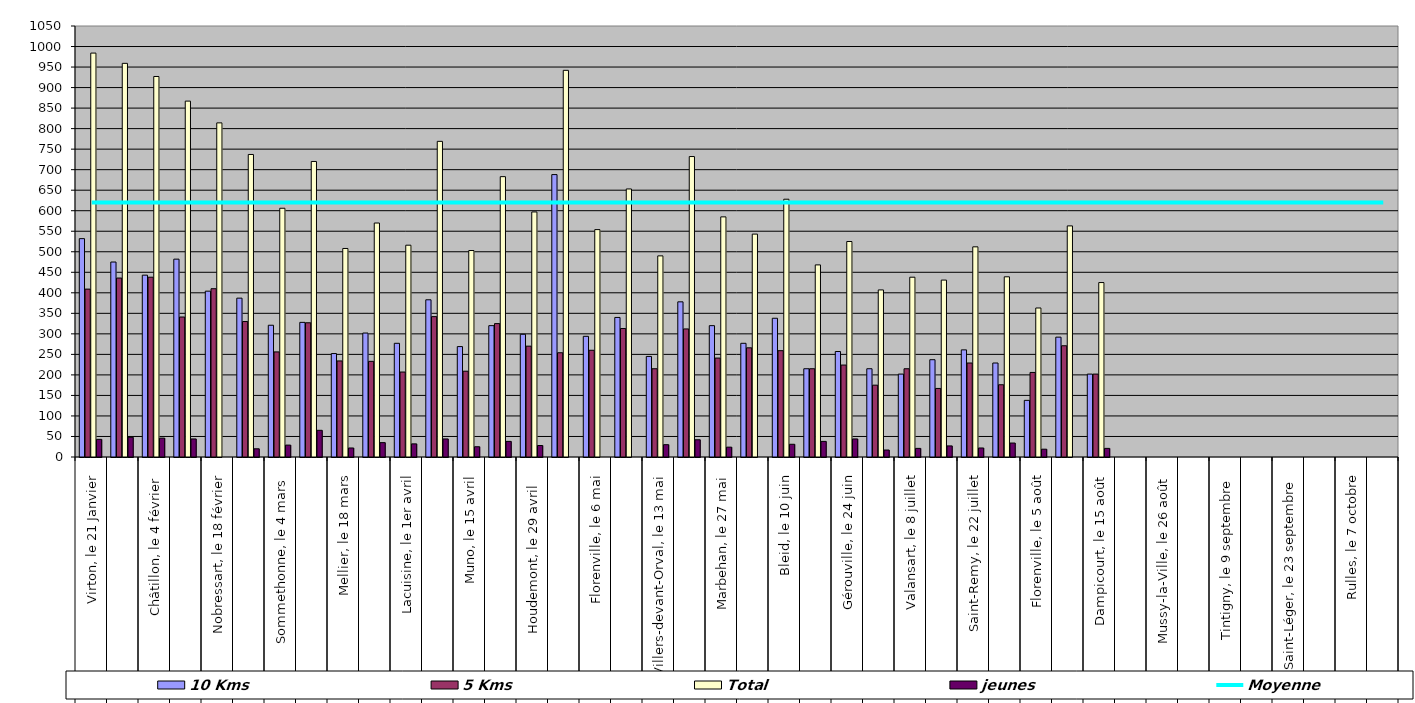
| Category | 10 Kms | 5 Kms | Total | jeunes |
|---|---|---|---|---|
| 0 | 532 | 409 | 984 | 43 |
| 1 | 475 | 436 | 959 | 48 |
| 2 | 443 | 438 | 927 | 46 |
| 3 | 482 | 341 | 867 | 44 |
| 4 | 404 | 410 | 814 | 0 |
| 5 | 387 | 330 | 737 | 20 |
| 6 | 321 | 256 | 606 | 29 |
| 7 | 328 | 327 | 720 | 65 |
| 8 | 252 | 234 | 508 | 22 |
| 9 | 302 | 233 | 570 | 35 |
| 10 | 277 | 207 | 516 | 32 |
| 11 | 383 | 342 | 769 | 44 |
| 12 | 269 | 209 | 503 | 25 |
| 13 | 320 | 325 | 683 | 38 |
| 14 | 299 | 270 | 597 | 28 |
| 15 | 688 | 254 | 942 | 0 |
| 16 | 294 | 260 | 554 | 0 |
| 17 | 340 | 313 | 653 | 0 |
| 18 | 245 | 215 | 490 | 30 |
| 19 | 378 | 312 | 732 | 42 |
| 20 | 320 | 241 | 585 | 24 |
| 21 | 277 | 266 | 543 | 0 |
| 22 | 338 | 259 | 628 | 31 |
| 23 | 215 | 215 | 468 | 38 |
| 24 | 257 | 224 | 525 | 44 |
| 25 | 215 | 175 | 407 | 17 |
| 26 | 202 | 215 | 438 | 21 |
| 27 | 237 | 167 | 431 | 27 |
| 28 | 261 | 229 | 512 | 22 |
| 29 | 229 | 176 | 439 | 34 |
| 30 | 138 | 206 | 363 | 19 |
| 31 | 292 | 271 | 563 | 0 |
| 32 | 202 | 202 | 425 | 21 |
| 33 | 0 | 0 | 0 | 0 |
| 34 | 0 | 0 | 0 | 0 |
| 35 | 0 | 0 | 0 | 0 |
| 36 | 0 | 0 | 0 | 0 |
| 37 | 0 | 0 | 0 | 0 |
| 38 | 0 | 0 | 0 | 0 |
| 39 | 0 | 0 | 0 | 0 |
| 40 | 0 | 0 | 0 | 0 |
| 41 | 0 | 0 | 0 | 0 |